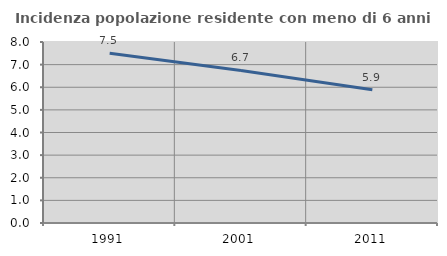
| Category | Incidenza popolazione residente con meno di 6 anni |
|---|---|
| 1991.0 | 7.507 |
| 2001.0 | 6.741 |
| 2011.0 | 5.894 |